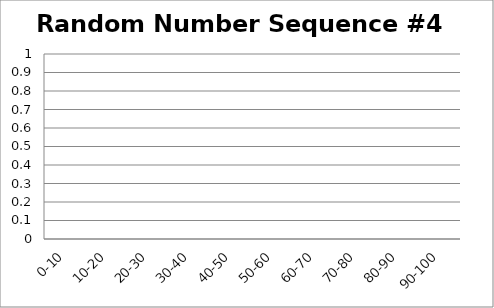
| Category | Random Number Sequence #4 |
|---|---|
| 0-10 | 0 |
| 10-20 | 0 |
| 20-30 | 0 |
| 30-40 | 0 |
| 40-50 | 0 |
| 50-60 | 0 |
| 60-70 | 0 |
| 70-80 | 0 |
| 80-90 | 0 |
| 90-100 | 0 |